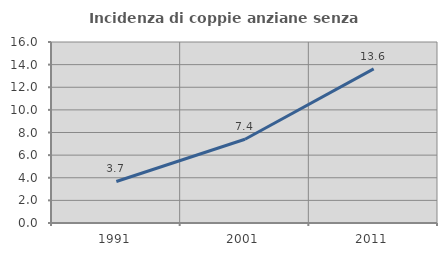
| Category | Incidenza di coppie anziane senza figli  |
|---|---|
| 1991.0 | 3.671 |
| 2001.0 | 7.401 |
| 2011.0 | 13.628 |